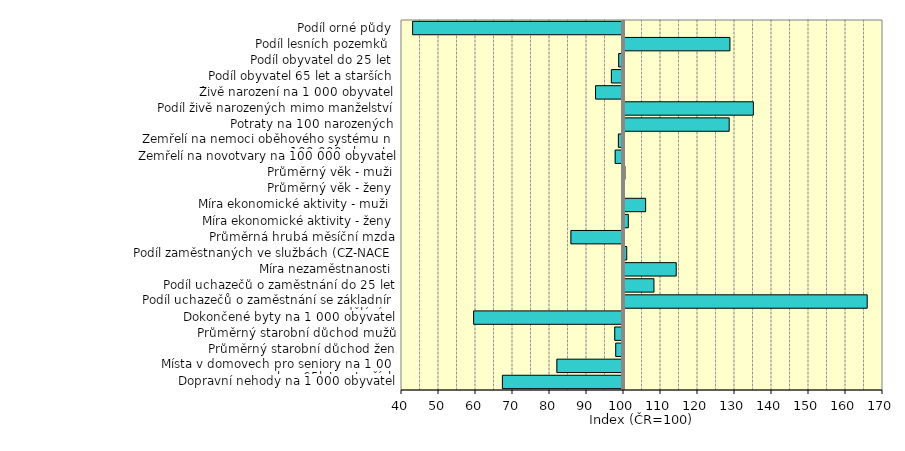
| Category | Series 0 |
|---|---|
| Dopravní nehody na 1 000 obyvatel | 67.275 |
| Místa v domovech pro seniory na 1 000 obyv 65let a starších | 81.995 |
| Průměrný starobní důchod žen | 97.901 |
| Průměrný starobní důchod mužů | 97.635 |
| Dokončené byty na 1 000 obyvatel | 59.495 |
| Podíl uchazečů o zaměstnání se základním vzděláním | 165.734 |
| Podíl uchazečů o zaměstnání do 25 let | 108.096 |
| Míra nezaměstnanosti | 114.114 |
| Podíl zaměstnaných ve službách (CZ-NACE) | 100.74 |
| Průměrná hrubá měsíční mzda | 85.788 |
| Míra ekonomické aktivity - ženy | 101.169 |
| Míra ekonomické aktivity - muži  | 105.847 |
| Průměrný věk - ženy | 99.833 |
| Průměrný věk - muži | 100.258 |
| Zemřelí na novotvary na 100 000 obyvatel | 97.749 |
| Zemřelí na nemoci oběhového systému na 100 000 obyvatel | 98.62 |
| Potraty na 100 narozených | 128.43 |
| Podíl živě narozených mimo manželství | 134.965 |
| Živě narození na 1 000 obyvatel | 92.442 |
| Podíl obyvatel 65 let a starších | 96.724 |
| Podíl obyvatel do 25 let | 98.706 |
| Podíl lesních pozemků  | 128.629 |
| Podíl orné půdy | 43.005 |